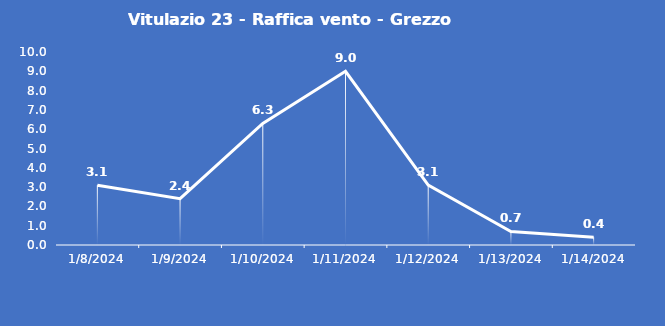
| Category | Vitulazio 23 - Raffica vento - Grezzo (m/s) |
|---|---|
| 1/8/24 | 3.1 |
| 1/9/24 | 2.4 |
| 1/10/24 | 6.3 |
| 1/11/24 | 9 |
| 1/12/24 | 3.1 |
| 1/13/24 | 0.7 |
| 1/14/24 | 0.4 |